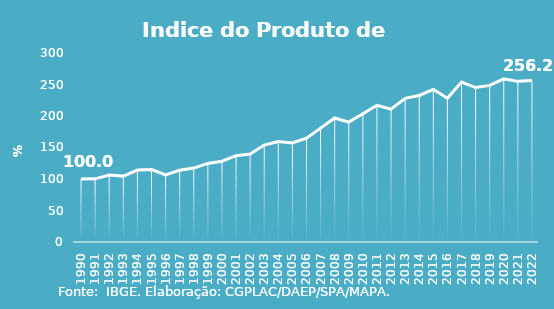
| Category | Indice de Prod. base 1990 |
|---|---|
| 1990.0 | 100 |
| 1991.0 | 100.275 |
| 1992.0 | 106.203 |
| 1993.0 | 104.57 |
| 1994.0 | 114.164 |
| 1995.0 | 115.024 |
| 1996.0 | 106.552 |
| 1997.0 | 114.037 |
| 1998.0 | 117.319 |
| 1999.0 | 124.734 |
| 2000.0 | 128.293 |
| 2001.0 | 136.975 |
| 2002.0 | 139.51 |
| 2003.0 | 153.868 |
| 2004.0 | 159.641 |
| 2005.0 | 157.136 |
| 2006.0 | 164.858 |
| 2007.0 | 180.781 |
| 2008.0 | 196.91 |
| 2009.0 | 190.309 |
| 2010.0 | 203.581 |
| 2011.0 | 217.041 |
| 2012.0 | 210.932 |
| 2013.0 | 228.009 |
| 2014.0 | 232.562 |
| 2015.0 | 242.318 |
| 2016.0 | 228.239 |
| 2017.0 | 253.826 |
| 2018.0 | 245.134 |
| 2019.0 | 248.619 |
| 2020.0 | 258.848 |
| 2021.0 | 254.988 |
| 2022.0 | 256.245 |